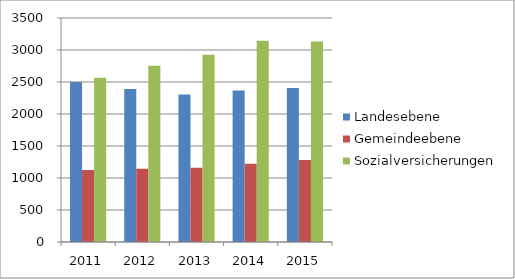
| Category | Landesebene | Gemeindeebene | Sozialversicherungen |
|---|---|---|---|
| 2011.0 | 2499 | 1124 | 2566 |
| 2012.0 | 2389 | 1143 | 2754 |
| 2013.0 | 2304 | 1159 | 2925 |
| 2014.0 | 2369 | 1223 | 3144 |
| 2015.0 | 2408 | 1280 | 3131 |